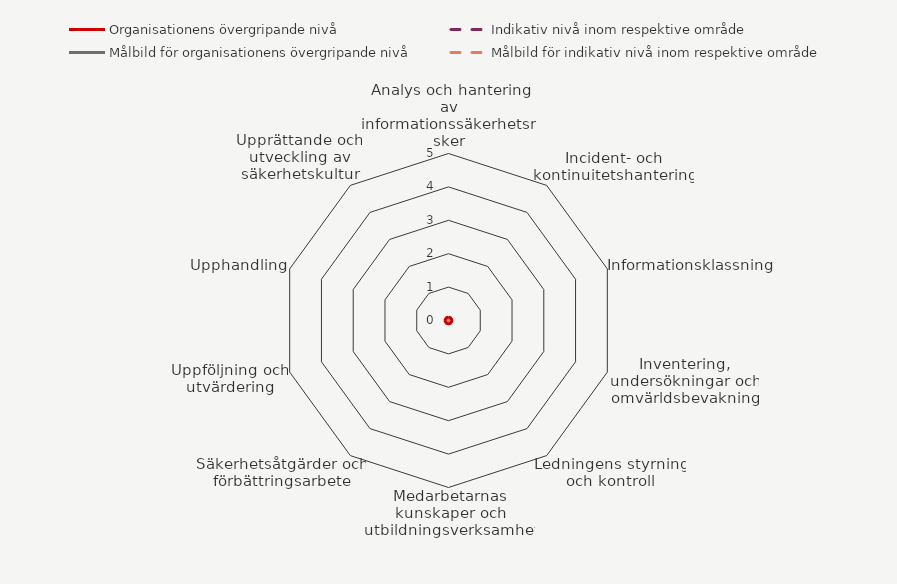
| Category | Organisationens övergripande nivå | Indikativ nivå inom respektive område | Målbild för organisationens övergripande nivå | Målbild för indikativ nivå inom respektive område |
|---|---|---|---|---|
| Analys och hantering av informationssäkerhetsrisker | 0.1 | 0 | 0 | 0 |
| Incident- och kontinuitetshantering | 0.1 | 0 | 0 | 0 |
| Informationsklassning | 0.1 | 0 | 0 | 0 |
| Inventering, undersökningar och omvärldsbevakning | 0.1 | 0 | 0 | 0 |
| Ledningens styrning och kontroll | 0.1 | 0 | 0 | 0 |
| Medarbetarnas kunskaper och utbildningsverksamhet | 0.1 | 0 | 0 | 0 |
| Säkerhetsåtgärder och förbättringsarbete | 0.1 | 0 | 0 | 0 |
| Uppföljning och utvärdering | 0.1 | 0 | 0 | 0 |
| Upphandling | 0.1 | 0 | 0 | 0 |
| Upprättande och utveckling av säkerhetskultur | 0.1 | 0 | 0 | 0 |